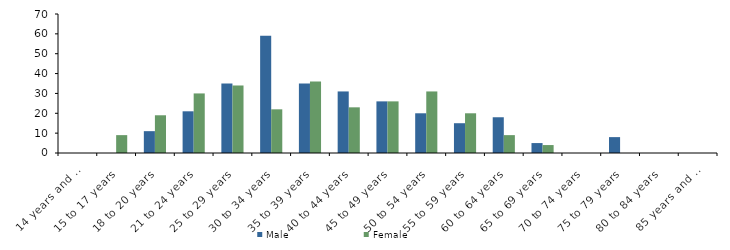
| Category | Male | Female |
|---|---|---|
| 14 years and under | 0 | 0 |
| 15 to 17 years | 0 | 9 |
| 18 to 20 years | 11 | 19 |
| 21 to 24 years | 21 | 30 |
| 25 to 29 years | 35 | 34 |
| 30 to 34 years | 59 | 22 |
| 35 to 39 years | 35 | 36 |
| 40 to 44 years | 31 | 23 |
| 45 to 49 years | 26 | 26 |
| 50 to 54 years | 20 | 31 |
| 55 to 59 years | 15 | 20 |
| 60 to 64 years | 18 | 9 |
| 65 to 69 years | 5 | 4 |
| 70 to 74 years | 0 | 0 |
| 75 to 79 years | 8 | 0 |
| 80 to 84 years | 0 | 0 |
| 85 years and over | 0 | 0 |